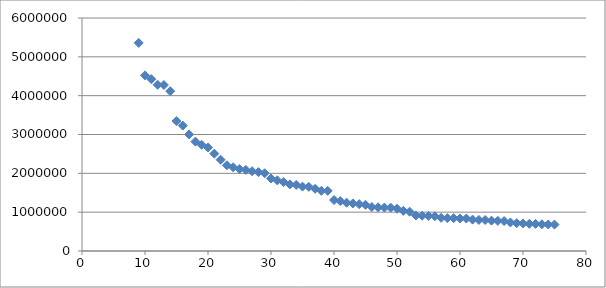
| Category | Series 0 |
|---|---|
| 9.0 | 5358130 |
| 10.0 | 4522858 |
| 11.0 | 4425110 |
| 12.0 | 4281899 |
| 13.0 | 4274531 |
| 14.0 | 4115871 |
| 15.0 | 3344813 |
| 16.0 | 3229878 |
| 17.0 | 3001072 |
| 18.0 | 2816710 |
| 19.0 | 2733761 |
| 20.0 | 2667117 |
| 21.0 | 2506626 |
| 22.0 | 2351192 |
| 23.0 | 2207462 |
| 24.0 | 2155137 |
| 25.0 | 2109832 |
| 26.0 | 2088291 |
| 27.0 | 2054574 |
| 28.0 | 2031445 |
| 29.0 | 2002047 |
| 30.0 | 1865746 |
| 31.0 | 1819198 |
| 32.0 | 1773120 |
| 33.0 | 1715459 |
| 34.0 | 1701799 |
| 35.0 | 1658292 |
| 36.0 | 1652602 |
| 37.0 | 1600611 |
| 38.0 | 1550733 |
| 39.0 | 1549308 |
| 40.0 | 1313228 |
| 41.0 | 1285732 |
| 42.0 | 1244696 |
| 43.0 | 1225626 |
| 44.0 | 1206142 |
| 45.0 | 1190512 |
| 46.0 | 1134029 |
| 47.0 | 1124309 |
| 48.0 | 1117608 |
| 49.0 | 1115692 |
| 50.0 | 1088765 |
| 51.0 | 1034090 |
| 52.0 | 1012018 |
| 53.0 | 916079 |
| 54.0 | 909153 |
| 55.0 | 905034 |
| 56.0 | 895030 |
| 57.0 | 853919 |
| 58.0 | 846101 |
| 59.0 | 845913 |
| 60.0 | 837925 |
| 61.0 | 836544 |
| 62.0 | 808210 |
| 63.0 | 800458 |
| 64.0 | 797740 |
| 65.0 | 781352 |
| 66.0 | 776742 |
| 67.0 | 770037 |
| 68.0 | 734669 |
| 69.0 | 716030 |
| 70.0 | 710514 |
| 71.0 | 699356 |
| 72.0 | 698497 |
| 73.0 | 687181 |
| 74.0 | 682657 |
| 75.0 | 681525 |